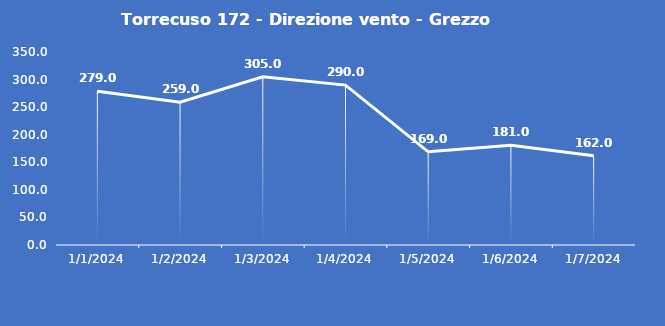
| Category | Torrecuso 172 - Direzione vento - Grezzo (°N) |
|---|---|
| 1/1/24 | 279 |
| 1/2/24 | 259 |
| 1/3/24 | 305 |
| 1/4/24 | 290 |
| 1/5/24 | 169 |
| 1/6/24 | 181 |
| 1/7/24 | 162 |